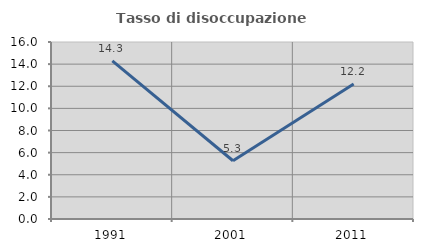
| Category | Tasso di disoccupazione giovanile  |
|---|---|
| 1991.0 | 14.286 |
| 2001.0 | 5.263 |
| 2011.0 | 12.195 |